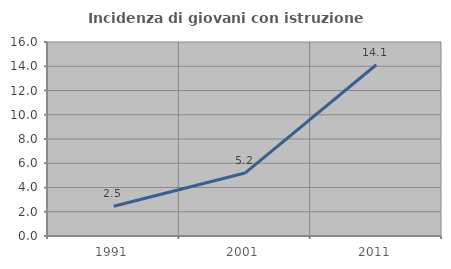
| Category | Incidenza di giovani con istruzione universitaria |
|---|---|
| 1991.0 | 2.452 |
| 2001.0 | 5.191 |
| 2011.0 | 14.122 |